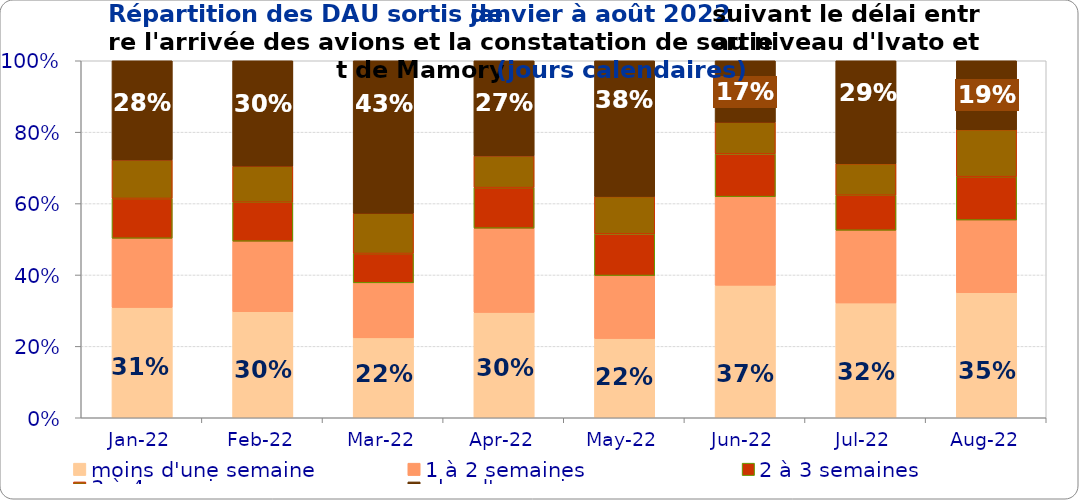
| Category | moins d'une semaine | 1 à 2 semaines | 2 à 3 semaines | 3 à 4 semaines | plus d'un mois |
|---|---|---|---|---|---|
| 2022-01-01 | 0.309 | 0.194 | 0.112 | 0.108 | 0.278 |
| 2022-02-01 | 0.297 | 0.197 | 0.109 | 0.101 | 0.295 |
| 2022-03-01 | 0.224 | 0.154 | 0.082 | 0.113 | 0.427 |
| 2022-04-01 | 0.295 | 0.236 | 0.114 | 0.089 | 0.266 |
| 2022-05-01 | 0.222 | 0.177 | 0.117 | 0.105 | 0.38 |
| 2022-06-01 | 0.371 | 0.248 | 0.12 | 0.089 | 0.172 |
| 2022-07-01 | 0.322 | 0.204 | 0.098 | 0.088 | 0.288 |
| 2022-08-01 | 0.35 | 0.204 | 0.122 | 0.132 | 0.193 |